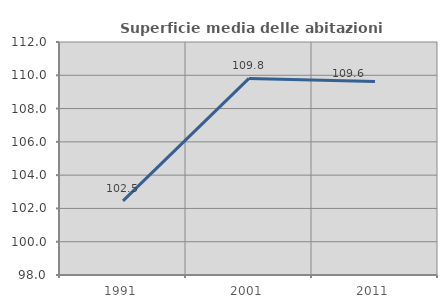
| Category | Superficie media delle abitazioni occupate |
|---|---|
| 1991.0 | 102.458 |
| 2001.0 | 109.813 |
| 2011.0 | 109.621 |